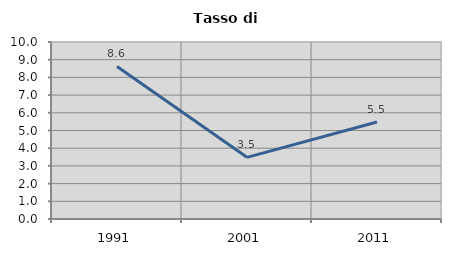
| Category | Tasso di disoccupazione   |
|---|---|
| 1991.0 | 8.621 |
| 2001.0 | 3.484 |
| 2011.0 | 5.479 |